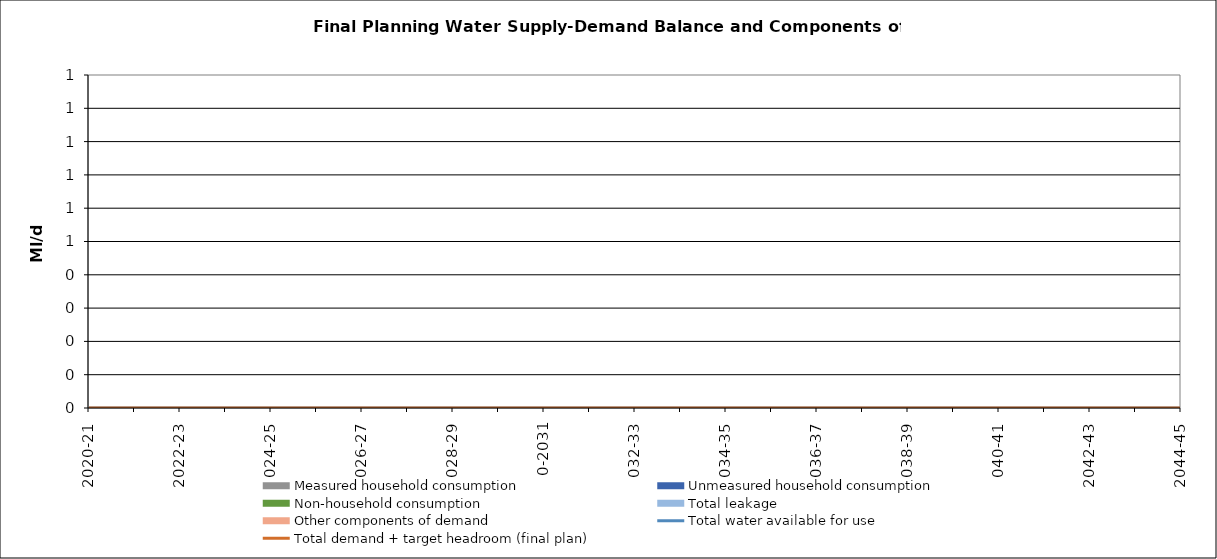
| Category | Total water available for use | Total demand + target headroom (final plan) |
|---|---|---|
| 0 | 0 | 0 |
| 1 | 0 | 0 |
| 2 | 0 | 0 |
| 3 | 0 | 0 |
| 4 | 0 | 0 |
| 5 | 0 | 0 |
| 6 | 0 | 0 |
| 7 | 0 | 0 |
| 8 | 0 | 0 |
| 9 | 0 | 0 |
| 10 | 0 | 0 |
| 11 | 0 | 0 |
| 12 | 0 | 0 |
| 13 | 0 | 0 |
| 14 | 0 | 0 |
| 15 | 0 | 0 |
| 16 | 0 | 0 |
| 17 | 0 | 0 |
| 18 | 0 | 0 |
| 19 | 0 | 0 |
| 20 | 0 | 0 |
| 21 | 0 | 0 |
| 22 | 0 | 0 |
| 23 | 0 | 0 |
| 24 | 0 | 0 |